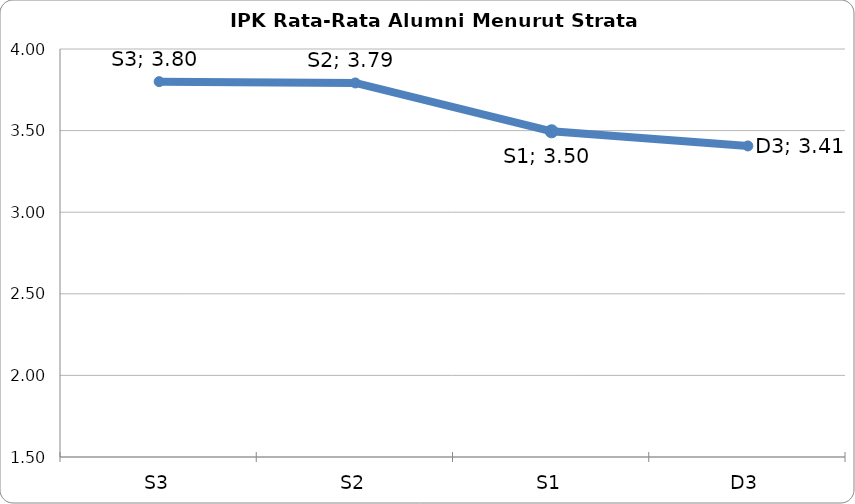
| Category | Series 0 |
|---|---|
| S3 | 3.8 |
| S2 | 3.792 |
| S1 | 3.496 |
| D3 | 3.406 |